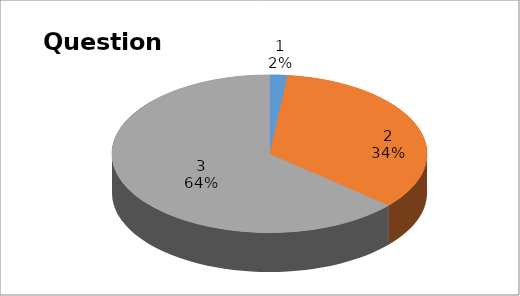
| Category | Series 0 |
|---|---|
| 0 | 1 |
| 1 | 19 |
| 2 | 35 |